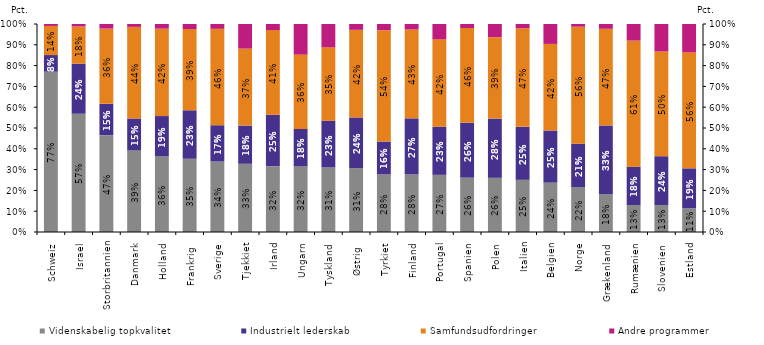
| Category | Videnskabelig topkvalitet | Industrielt lederskab | Samfundsudfordringer | Andre programmer |
|---|---|---|---|---|
| Schweiz | 0.771 | 0.08 | 0.14 | 0.009 |
| Israel | 0.569 | 0.24 | 0.18 | 0.012 |
| Storbritannien | 0.466 | 0.15 | 0.362 | 0.022 |
| Danmark | 0.394 | 0.152 | 0.44 | 0.014 |
| Holland | 0.364 | 0.193 | 0.42 | 0.022 |
| Frankrig  | 0.352 | 0.233 | 0.391 | 0.024 |
| Sverige | 0.339 | 0.175 | 0.464 | 0.023 |
| Tjekkiet | 0.328 | 0.184 | 0.37 | 0.118 |
| Irland | 0.316 | 0.247 | 0.407 | 0.029 |
| Ungarn | 0.316 | 0.18 | 0.357 | 0.147 |
| Tyskland | 0.31 | 0.225 | 0.352 | 0.112 |
| Østrig  | 0.307 | 0.244 | 0.421 | 0.028 |
| Tyrkiet | 0.277 | 0.158 | 0.535 | 0.03 |
| Finland | 0.277 | 0.27 | 0.427 | 0.026 |
| Portugal | 0.275 | 0.231 | 0.42 | 0.074 |
| Spanien | 0.261 | 0.264 | 0.456 | 0.019 |
| Polen | 0.26 | 0.285 | 0.391 | 0.063 |
| Italien | 0.251 | 0.255 | 0.474 | 0.02 |
| Belgien | 0.237 | 0.251 | 0.416 | 0.096 |
| Norge | 0.216 | 0.208 | 0.562 | 0.013 |
| Grækenland | 0.182 | 0.33 | 0.465 | 0.023 |
| Rumænien | 0.129 | 0.185 | 0.606 | 0.08 |
| Slovenien  | 0.129 | 0.236 | 0.503 | 0.132 |
| Estland | 0.114 | 0.192 | 0.558 | 0.136 |